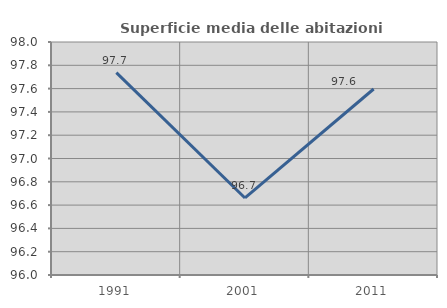
| Category | Superficie media delle abitazioni occupate |
|---|---|
| 1991.0 | 97.738 |
| 2001.0 | 96.661 |
| 2011.0 | 97.596 |